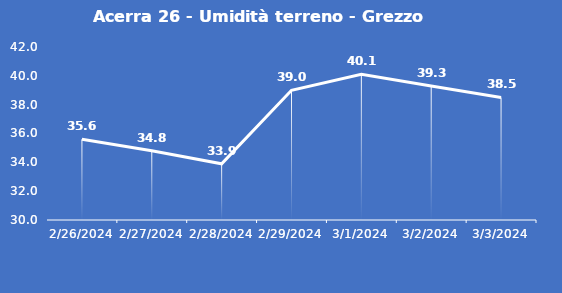
| Category | Acerra 26 - Umidità terreno - Grezzo (%VWC) |
|---|---|
| 2/26/24 | 35.6 |
| 2/27/24 | 34.8 |
| 2/28/24 | 33.9 |
| 2/29/24 | 39 |
| 3/1/24 | 40.1 |
| 3/2/24 | 39.3 |
| 3/3/24 | 38.5 |